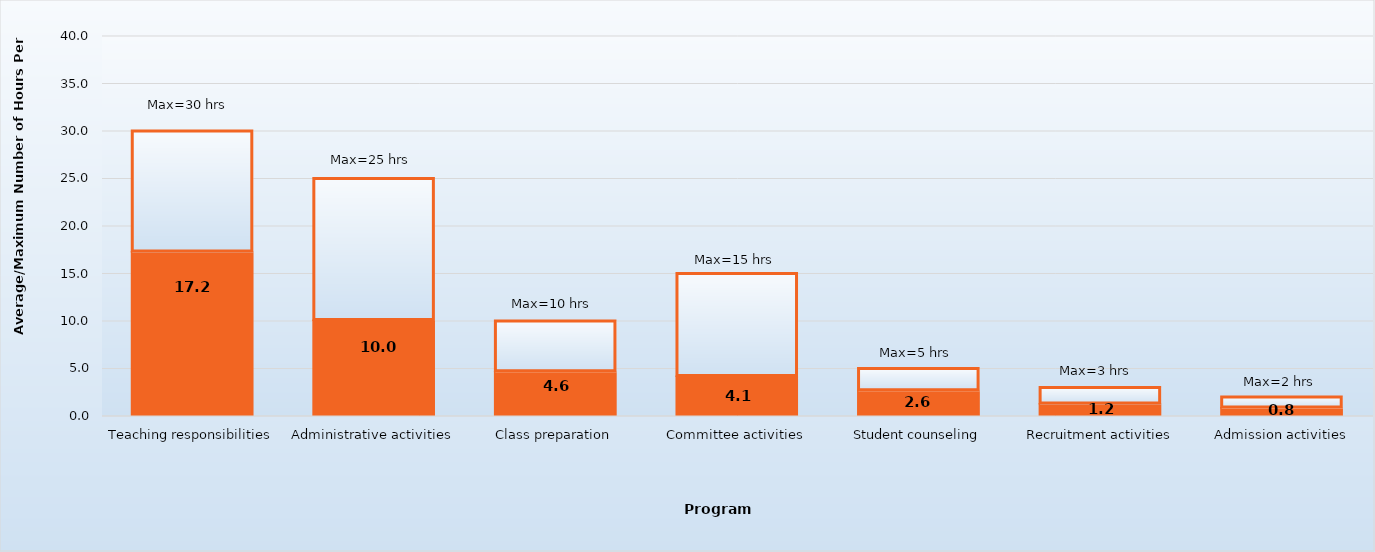
| Category | Average hours per week | Maximum |
|---|---|---|
| Teaching responsibilities | 17.2 | 12.8 |
| Administrative activities | 10 | 15 |
| Class preparation | 4.6 | 5.4 |
| Committee activities | 4.1 | 10.9 |
| Student counseling | 2.6 | 2.4 |
| Recruitment activities | 1.2 | 1.8 |
| Admission activities | 0.8 | 1.2 |